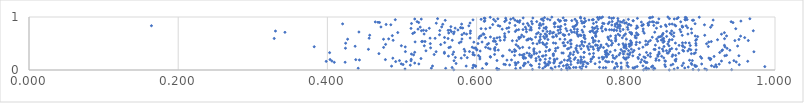
| Category | Series 0 |
|---|---|
| 0.8582741364750182 | 0.001 |
| 0.8976763181570795 | 0.002 |
| 0.8237760456987292 | 0.003 |
| 0.5694237773553649 | 0.004 |
| 0.9084141558878296 | 0.005 |
| 0.9418973582718112 | 0.006 |
| 0.7216196528349432 | 0.007 |
| 0.7136465965242803 | 0.008 |
| 0.6276302751861649 | 0.009 |
| 0.8901277438105396 | 0.01 |
| 0.6749223983946601 | 0.011 |
| 0.8370869075136855 | 0.012 |
| 0.6298730154496538 | 0.013 |
| 0.8273972351592285 | 0.014 |
| 0.8280837848045491 | 0.015 |
| 0.7014530784217442 | 0.016 |
| 0.8648321436666556 | 0.017 |
| 0.7938838933704971 | 0.018 |
| 0.5040525475562254 | 0.019 |
| 0.7406610888725684 | 0.02 |
| 0.9059473629559929 | 0.021 |
| 0.8307056241590003 | 0.022 |
| 0.7847032862850102 | 0.023 |
| 0.8387430591247179 | 0.024 |
| 0.8108602469489412 | 0.025 |
| 0.8265340313378468 | 0.026 |
| 0.6077258045349223 | 0.027 |
| 0.6523791735753867 | 0.028 |
| 0.725063278326307 | 0.029 |
| 0.6889151818714941 | 0.03 |
| 0.5585385371477021 | 0.031 |
| 0.6270687100896097 | 0.032 |
| 0.44128946082872156 | 0.033 |
| 0.5393229535069063 | 0.034 |
| 0.8381219890604471 | 0.035 |
| 0.720513458083019 | 0.036 |
| 0.6997725069637214 | 0.037 |
| 0.8790277277675254 | 0.038 |
| 0.6586434599082034 | 0.039 |
| 0.8694817511855355 | 0.04 |
| 0.5947266824163308 | 0.041 |
| 0.8096242450041077 | 0.042 |
| 0.7699148923073809 | 0.043 |
| 0.827348611495336 | 0.044 |
| 0.7731475927238503 | 0.045 |
| 0.7852797130322222 | 0.046 |
| 0.5671614494786639 | 0.047 |
| 0.7332083774916002 | 0.048 |
| 0.7300082533122625 | 0.049 |
| 0.764747616912369 | 0.05 |
| 0.683904922039382 | 0.051 |
| 0.7239705534848434 | 0.052 |
| 0.8126485312027693 | 0.053 |
| 0.7384041704326343 | 0.054 |
| 0.7939337775069143 | 0.055 |
| 0.8837233391431959 | 0.056 |
| 0.7053134171339153 | 0.057 |
| 0.8345215730469541 | 0.058 |
| 0.8033565028722792 | 0.059 |
| 0.9216912793096238 | 0.06 |
| 0.7467499574226467 | 0.061 |
| 0.9184354692431691 | 0.062 |
| 0.6916877344854793 | 0.063 |
| 0.9863452563813437 | 0.064 |
| 0.8531298462391763 | 0.065 |
| 0.8152474968169845 | 0.066 |
| 0.8932193576928893 | 0.067 |
| 0.788804783527499 | 0.068 |
| 0.5986289522120753 | 0.069 |
| 0.71051275683214 | 0.07 |
| 0.7420151595686844 | 0.071 |
| 0.8947660037787537 | 0.072 |
| 0.4859913315547175 | 0.073 |
| 0.586017793612868 | 0.074 |
| 0.5408930124378334 | 0.075 |
| 0.8360283785300437 | 0.076 |
| 0.5985974232400109 | 0.077 |
| 0.8230012174411447 | 0.078 |
| 0.71635250161292 | 0.079 |
| 0.9148802630985745 | 0.08 |
| 0.6628800588081458 | 0.081 |
| 0.6735982482057143 | 0.082 |
| 0.8754704759497594 | 0.083 |
| 0.8018645242041955 | 0.084 |
| 0.7202793350578675 | 0.085 |
| 0.6937111075323674 | 0.086 |
| 0.5964522075114794 | 0.087 |
| 0.8924737415649081 | 0.088 |
| 0.6630993116032446 | 0.089 |
| 0.595596661095406 | 0.09 |
| 0.5111539935415604 | 0.091 |
| 0.8605487900653713 | 0.092 |
| 0.7219119212028842 | 0.093 |
| 0.6523314785066997 | 0.094 |
| 0.644273276599542 | 0.095 |
| 0.6961365769236965 | 0.096 |
| 0.6721205086814975 | 0.097 |
| 0.8522915227807563 | 0.098 |
| 0.9207568586809256 | 0.099 |
| 0.9521034114384889 | 0.1 |
| 0.721203620401484 | 0.101 |
| 0.6386050780346194 | 0.102 |
| 0.5014860420094708 | 0.103 |
| 0.7263607834323498 | 0.104 |
| 0.8885564878332559 | 0.105 |
| 0.6131774869483361 | 0.106 |
| 0.7427921003637168 | 0.107 |
| 0.8630989765681591 | 0.108 |
| 0.6365451297854502 | 0.109 |
| 0.9251820246565144 | 0.11 |
| 0.6840466550782527 | 0.111 |
| 0.6952049464310714 | 0.112 |
| 0.9016961942884266 | 0.113 |
| 0.5225894145029972 | 0.114 |
| 0.7877193996984917 | 0.115 |
| 0.49901359586347394 | 0.116 |
| 0.6531980461106117 | 0.117 |
| 0.6137103922300591 | 0.118 |
| 0.7588471094654766 | 0.119 |
| 0.6127587380566814 | 0.12 |
| 0.7492065142721007 | 0.121 |
| 0.6653063161556252 | 0.122 |
| 0.5724797340733343 | 0.123 |
| 0.6919443023335441 | 0.124 |
| 0.887775190024627 | 0.125 |
| 0.7872191051224524 | 0.126 |
| 0.6640776386633368 | 0.127 |
| 0.8772568626562063 | 0.128 |
| 0.7117718318640962 | 0.129 |
| 0.7479834530722981 | 0.13 |
| 0.5170516962216556 | 0.131 |
| 0.7035643541820445 | 0.132 |
| 0.7936544616227341 | 0.133 |
| 0.7394412461274775 | 0.134 |
| 0.8020146003192212 | 0.135 |
| 0.7356486588664339 | 0.136 |
| 0.6982336398733634 | 0.137 |
| 0.6516982887796747 | 0.138 |
| 0.9390756271664052 | 0.139 |
| 0.703751328423472 | 0.14 |
| 0.828431750318176 | 0.141 |
| 0.6913240975167729 | 0.142 |
| 0.8267787471165376 | 0.143 |
| 0.6557147427029507 | 0.144 |
| 0.40922007996131926 | 0.145 |
| 0.42376840282240735 | 0.146 |
| 0.8199097765345135 | 0.147 |
| 0.6690711219435642 | 0.148 |
| 0.7138193278340502 | 0.149 |
| 0.7649235464511379 | 0.15 |
| 0.9480930056666708 | 0.151 |
| 0.7751211741671672 | 0.152 |
| 0.7423362245660975 | 0.153 |
| 0.7820380174478635 | 0.154 |
| 0.7772850506151127 | 0.155 |
| 0.7450496844802189 | 0.156 |
| 0.6970199255001501 | 0.157 |
| 0.5057764141821302 | 0.158 |
| 0.4915293472723925 | 0.159 |
| 0.7530412249525755 | 0.16 |
| 0.7261960749198186 | 0.161 |
| 0.7394898579108997 | 0.162 |
| 0.39840193632108767 | 0.163 |
| 0.9634443332764876 | 0.164 |
| 0.824909611711165 | 0.165 |
| 0.8531487201098605 | 0.166 |
| 0.7729292811319619 | 0.167 |
| 0.8669036944757307 | 0.168 |
| 0.9282313750918887 | 0.169 |
| 0.4059776258248631 | 0.17 |
| 0.7047686554659525 | 0.171 |
| 0.8523778988484354 | 0.172 |
| 0.6796905246392269 | 0.173 |
| 0.512122007612196 | 0.174 |
| 0.5697570883010715 | 0.175 |
| 0.9449302694775105 | 0.176 |
| 0.4966236866631476 | 0.177 |
| 0.8891972235415212 | 0.178 |
| 0.6273161460076018 | 0.179 |
| 0.7218135173474557 | 0.18 |
| 0.7360994141310385 | 0.181 |
| 0.8403213431574477 | 0.182 |
| 0.8445251296891821 | 0.183 |
| 0.8854598691364275 | 0.184 |
| 0.6851690340423318 | 0.185 |
| 0.6406830458229078 | 0.186 |
| 0.8660185780543344 | 0.187 |
| 0.7176709679625801 | 0.188 |
| 0.4429156773063323 | 0.189 |
| 0.6467454686423485 | 0.19 |
| 0.7041964988755149 | 0.191 |
| 0.7235820084747144 | 0.192 |
| 0.8213264437394915 | 0.193 |
| 0.9132457681950416 | 0.194 |
| 0.4380238822908109 | 0.195 |
| 0.47775142312853847 | 0.196 |
| 0.4035524476639756 | 0.197 |
| 0.7403329388743919 | 0.198 |
| 0.6852401432731102 | 0.199 |
| 0.7308629213624765 | 0.2 |
| 0.7042224337131212 | 0.201 |
| 0.5123529038467153 | 0.202 |
| 0.8001908170853671 | 0.203 |
| 0.6920817474447165 | 0.204 |
| 0.7532727865347737 | 0.205 |
| 0.8674686824438528 | 0.206 |
| 0.7691384583560632 | 0.207 |
| 0.7542908467044508 | 0.208 |
| 0.604450082546534 | 0.209 |
| 0.9140183111713269 | 0.21 |
| 0.7078417061318952 | 0.211 |
| 0.7986071386932799 | 0.212 |
| 0.9135562676843748 | 0.213 |
| 0.8406895910548227 | 0.214 |
| 0.8168510536099371 | 0.215 |
| 0.5254304153991952 | 0.216 |
| 0.6796228207506474 | 0.217 |
| 0.6631027516596061 | 0.218 |
| 0.6981981143518146 | 0.219 |
| 0.7853752898928222 | 0.22 |
| 0.7252729752644071 | 0.221 |
| 0.9016754412950982 | 0.222 |
| 0.48772087337826475 | 0.223 |
| 0.579366026509506 | 0.224 |
| 0.9114261133873491 | 0.225 |
| 0.6656789324042717 | 0.226 |
| 0.801004524993636 | 0.227 |
| 0.7640624321156169 | 0.228 |
| 0.8508654586026889 | 0.229 |
| 0.7833924937152841 | 0.23 |
| 0.7323172187649395 | 0.231 |
| 0.826078555575667 | 0.232 |
| 0.5874454064504654 | 0.233 |
| 0.6624720127500072 | 0.234 |
| 0.7970571549735359 | 0.235 |
| 0.7707498724123028 | 0.236 |
| 0.5715391714333865 | 0.237 |
| 0.8163650070177663 | 0.238 |
| 0.6729637792200457 | 0.239 |
| 0.7436410776056688 | 0.24 |
| 0.8035398044861682 | 0.241 |
| 0.6185827481004782 | 0.242 |
| 0.7683001344850062 | 0.243 |
| 0.7566498639248251 | 0.244 |
| 0.6043980583315326 | 0.245 |
| 0.7396865584927725 | 0.246 |
| 0.82422102823127 | 0.247 |
| 0.7742831743883563 | 0.248 |
| 0.6832705747456064 | 0.249 |
| 0.7563428830135567 | 0.25 |
| 0.9001272639893485 | 0.251 |
| 0.8329982261493788 | 0.252 |
| 0.6183809799610159 | 0.253 |
| 0.6631192319487419 | 0.254 |
| 0.7876371224831229 | 0.255 |
| 0.9183737380282514 | 0.256 |
| 0.8621462819942931 | 0.257 |
| 0.8430450605545056 | 0.258 |
| 0.8480424471388103 | 0.259 |
| 0.7235367505965271 | 0.26 |
| 0.6881931110354094 | 0.261 |
| 0.5622826218805154 | 0.262 |
| 0.6346940974018793 | 0.263 |
| 0.7742684167817606 | 0.264 |
| 0.6894490330542583 | 0.265 |
| 0.6354452560073114 | 0.266 |
| 0.8093984967486207 | 0.267 |
| 0.932731659107641 | 0.268 |
| 0.9515928602647085 | 0.269 |
| 0.702939961251546 | 0.27 |
| 0.6706993181959305 | 0.271 |
| 0.6738968448378818 | 0.272 |
| 0.6025608675158171 | 0.273 |
| 0.7824251576304497 | 0.274 |
| 0.8668080216378115 | 0.275 |
| 0.6509378804977536 | 0.276 |
| 0.9350138021501914 | 0.277 |
| 0.6928588596485337 | 0.278 |
| 0.8297408614179765 | 0.279 |
| 0.5837478279601344 | 0.28 |
| 0.6612459655849251 | 0.281 |
| 0.5969962184032506 | 0.282 |
| 0.842777753706921 | 0.283 |
| 0.7909747641554549 | 0.284 |
| 0.5154907707932904 | 0.285 |
| 0.8630366493188799 | 0.286 |
| 0.8048224351376025 | 0.287 |
| 0.6578562388096575 | 0.288 |
| 0.8185351671108031 | 0.289 |
| 0.7295296635616885 | 0.29 |
| 0.5951372496175819 | 0.291 |
| 0.543119701789794 | 0.292 |
| 0.7729665870479432 | 0.293 |
| 0.6240853148777609 | 0.294 |
| 0.5679843055495114 | 0.295 |
| 0.776791030349619 | 0.296 |
| 0.7254992635210809 | 0.297 |
| 0.6636987167000702 | 0.298 |
| 0.702660434587025 | 0.299 |
| 0.8025569746284585 | 0.3 |
| 0.5126272276099963 | 0.301 |
| 0.7968985642745368 | 0.302 |
| 0.7029876105349265 | 0.303 |
| 0.7513859944607001 | 0.304 |
| 0.6772508164527109 | 0.305 |
| 0.6708607380079356 | 0.306 |
| 0.8448380213794393 | 0.307 |
| 0.8879009130740776 | 0.308 |
| 0.46908875763310065 | 0.309 |
| 0.891637247099603 | 0.31 |
| 0.775173601410945 | 0.311 |
| 0.8329263656347687 | 0.312 |
| 0.7567570909341929 | 0.313 |
| 0.5568750593757897 | 0.314 |
| 0.6802981467118386 | 0.315 |
| 0.8711453958351566 | 0.316 |
| 0.7923940792892693 | 0.317 |
| 0.8555596661109581 | 0.318 |
| 0.7161299676537856 | 0.319 |
| 0.7256702663998057 | 0.32 |
| 0.8570035809742791 | 0.321 |
| 0.7143132210107085 | 0.322 |
| 0.667526914355272 | 0.323 |
| 0.8059361013705348 | 0.324 |
| 0.8932508615928573 | 0.325 |
| 0.7730375054155892 | 0.326 |
| 0.40298241484974284 | 0.327 |
| 0.5952344966262383 | 0.328 |
| 0.7357423782290057 | 0.329 |
| 0.9258685370116716 | 0.33 |
| 0.8276870149861021 | 0.331 |
| 0.7441166624661839 | 0.332 |
| 0.7442201449435935 | 0.333 |
| 0.517034888166451 | 0.334 |
| 0.5568336723396891 | 0.335 |
| 0.7728564760716419 | 0.336 |
| 0.844522142997021 | 0.337 |
| 0.8092784136434801 | 0.338 |
| 0.5692143403636463 | 0.339 |
| 0.7304336072277758 | 0.34 |
| 0.6846163980814678 | 0.341 |
| 0.7791073778291748 | 0.342 |
| 0.6474553201184561 | 0.343 |
| 0.9717170937460184 | 0.344 |
| 0.545739941487806 | 0.345 |
| 0.6770168771301494 | 0.346 |
| 0.5045537319009502 | 0.347 |
| 0.5904344167136568 | 0.348 |
| 0.7959929480401952 | 0.349 |
| 0.6510115901634027 | 0.35 |
| 0.798334988101841 | 0.351 |
| 0.5844628187263631 | 0.352 |
| 0.6926166651098482 | 0.353 |
| 0.772339913609341 | 0.354 |
| 0.8586561837798175 | 0.355 |
| 0.8775939230017422 | 0.356 |
| 0.8501869598478652 | 0.357 |
| 0.6047666130947095 | 0.358 |
| 0.7056569792695385 | 0.359 |
| 0.8831728264718752 | 0.36 |
| 0.6525100544843159 | 0.361 |
| 0.5321010484827982 | 0.362 |
| 0.9285985967154812 | 0.363 |
| 0.7342281687415043 | 0.364 |
| 0.8544067329936805 | 0.365 |
| 0.8037455826115288 | 0.366 |
| 0.6970965509432656 | 0.367 |
| 0.8110495433105981 | 0.368 |
| 0.7745485859960419 | 0.369 |
| 0.6246697192289685 | 0.37 |
| 0.7857040281448109 | 0.371 |
| 0.7630462693240719 | 0.372 |
| 0.9394844535200422 | 0.373 |
| 0.8762930782246863 | 0.374 |
| 0.6441839863423131 | 0.375 |
| 0.6291147950627101 | 0.376 |
| 0.6002766028683125 | 0.377 |
| 0.9296126120052417 | 0.378 |
| 0.6765457940309099 | 0.379 |
| 0.8942371038295472 | 0.38 |
| 0.88723537002464 | 0.381 |
| 0.6980065690783607 | 0.382 |
| 0.7503943375371546 | 0.383 |
| 0.6508305989667271 | 0.384 |
| 0.7936321792144367 | 0.385 |
| 0.6002740684743854 | 0.386 |
| 0.8393363254883608 | 0.387 |
| 0.8592575848409291 | 0.388 |
| 0.8378746504117336 | 0.389 |
| 0.45500125071823194 | 0.39 |
| 0.5832998883156405 | 0.391 |
| 0.7566730070347412 | 0.392 |
| 0.8074602530492965 | 0.393 |
| 0.8677999306287894 | 0.394 |
| 0.8849802033181154 | 0.395 |
| 0.8491327256108735 | 0.396 |
| 0.6182087219211516 | 0.397 |
| 0.6238954379885004 | 0.398 |
| 0.7218833134342563 | 0.399 |
| 0.7400972556808333 | 0.4 |
| 0.7333037256341717 | 0.401 |
| 0.6769895037573368 | 0.402 |
| 0.8176422458456374 | 0.403 |
| 0.861596312058957 | 0.404 |
| 0.8008400677263291 | 0.405 |
| 0.7059525087684428 | 0.406 |
| 0.7236984663204293 | 0.407 |
| 0.9357746712527453 | 0.408 |
| 0.7625191202584245 | 0.409 |
| 0.7644136356520626 | 0.41 |
| 0.4242016712236679 | 0.411 |
| 0.6577385425967344 | 0.412 |
| 0.61572674800429 | 0.413 |
| 0.5966829516385175 | 0.414 |
| 0.7331050401358641 | 0.415 |
| 0.8448250602580282 | 0.416 |
| 0.5987696995652665 | 0.417 |
| 0.5383384754529609 | 0.418 |
| 0.7494000823352697 | 0.419 |
| 0.6705946321022107 | 0.42 |
| 0.7089013191010604 | 0.421 |
| 0.562835295938884 | 0.422 |
| 0.7700579842645395 | 0.423 |
| 0.6247574901267535 | 0.424 |
| 0.7976112215487932 | 0.425 |
| 0.4753452823644143 | 0.426 |
| 0.8788026233608505 | 0.427 |
| 0.6617441339210991 | 0.428 |
| 0.6120936775524779 | 0.429 |
| 0.5941618269946882 | 0.43 |
| 0.8229139226664309 | 0.431 |
| 0.7264453353151331 | 0.432 |
| 0.5648698380498439 | 0.433 |
| 0.6937050380750971 | 0.434 |
| 0.7559056889166946 | 0.435 |
| 0.5043651284619696 | 0.436 |
| 0.9329246505092607 | 0.437 |
| 0.7983522133907017 | 0.438 |
| 0.38232471976379134 | 0.439 |
| 0.7663672763700361 | 0.44 |
| 0.7980137134054377 | 0.441 |
| 0.7530917798148653 | 0.442 |
| 0.9106628874472238 | 0.443 |
| 0.8512266266685881 | 0.444 |
| 0.8049887451052631 | 0.445 |
| 0.6555357099995862 | 0.446 |
| 0.8761977204811647 | 0.447 |
| 0.4371694695083219 | 0.448 |
| 0.748593955802339 | 0.449 |
| 0.8000665409151727 | 0.45 |
| 0.7382754025729796 | 0.451 |
| 0.9498654987285099 | 0.452 |
| 0.743464558768164 | 0.453 |
| 0.7767059660049119 | 0.454 |
| 0.7172338178311412 | 0.455 |
| 0.8579759645835248 | 0.456 |
| 0.529889447030162 | 0.457 |
| 0.4991499900521096 | 0.458 |
| 0.7344412633160132 | 0.459 |
| 0.7186196769033993 | 0.46 |
| 0.8864738187502498 | 0.461 |
| 0.7621186525335506 | 0.462 |
| 0.7974415469543457 | 0.463 |
| 0.8760618029639792 | 0.464 |
| 0.871420442187014 | 0.465 |
| 0.9322462649003304 | 0.466 |
| 0.8942001736285748 | 0.467 |
| 0.7595349022490397 | 0.468 |
| 0.8396609597560512 | 0.469 |
| 0.7807666389589077 | 0.47 |
| 0.766781600174193 | 0.471 |
| 0.7600361663936063 | 0.472 |
| 0.6916387044153001 | 0.473 |
| 0.8074359485778111 | 0.474 |
| 0.8267094599450336 | 0.475 |
| 0.8050231261828162 | 0.476 |
| 0.6529043327484367 | 0.477 |
| 0.8000628292318607 | 0.478 |
| 0.8137138481796385 | 0.479 |
| 0.5518695309386712 | 0.48 |
| 0.7905197800610814 | 0.481 |
| 0.6143024839238072 | 0.482 |
| 0.47801732396350904 | 0.483 |
| 0.7410414394762322 | 0.484 |
| 0.8290704997029128 | 0.485 |
| 0.6268365482596113 | 0.486 |
| 0.8064300906576498 | 0.487 |
| 0.7265611375612478 | 0.488 |
| 0.7742250705267647 | 0.489 |
| 0.8045109530371417 | 0.49 |
| 0.8562962481991788 | 0.491 |
| 0.6893812566498186 | 0.492 |
| 0.7510477479091948 | 0.493 |
| 0.6810774084295128 | 0.494 |
| 0.9082801462652943 | 0.495 |
| 0.7963463521011159 | 0.496 |
| 0.726383071374737 | 0.497 |
| 0.5379725368596763 | 0.498 |
| 0.6018803604463271 | 0.499 |
| 0.6941052228427806 | 0.5 |
| 0.6160781284604702 | 0.501 |
| 0.8938739661805741 | 0.502 |
| 0.6754772313325117 | 0.503 |
| 0.7059694393103445 | 0.504 |
| 0.42446221698256537 | 0.505 |
| 0.7820808879406383 | 0.506 |
| 0.8075231697372253 | 0.507 |
| 0.8665100367271518 | 0.508 |
| 0.8850699925900317 | 0.509 |
| 0.7157436993210632 | 0.51 |
| 0.7029435095900985 | 0.511 |
| 0.5767506297927731 | 0.512 |
| 0.8759884748274545 | 0.513 |
| 0.8801478487809612 | 0.514 |
| 0.6884683832484525 | 0.515 |
| 0.7166519532794318 | 0.516 |
| 0.5571916951846254 | 0.517 |
| 0.6845323880143538 | 0.518 |
| 0.8187307393764381 | 0.519 |
| 0.7222400353931301 | 0.52 |
| 0.8500466278380759 | 0.521 |
| 0.8075123853912978 | 0.522 |
| 0.7563367461943392 | 0.523 |
| 0.8142878174213815 | 0.524 |
| 0.5963241993853069 | 0.525 |
| 0.7451977134020247 | 0.526 |
| 0.9111115322656899 | 0.527 |
| 0.6073454707278161 | 0.528 |
| 0.741244660578632 | 0.529 |
| 0.5175613763592313 | 0.53 |
| 0.5791891285324516 | 0.531 |
| 0.8303041075163181 | 0.532 |
| 0.7413960528607909 | 0.533 |
| 0.8574254178074988 | 0.534 |
| 0.7409868877794564 | 0.535 |
| 0.9145899977662599 | 0.536 |
| 0.5263820038914411 | 0.537 |
| 0.5308547280560618 | 0.538 |
| 0.5276178454162466 | 0.539 |
| 0.6250432013354896 | 0.54 |
| 0.8513900723031151 | 0.541 |
| 0.62485362554709 | 0.542 |
| 0.76377284684608 | 0.543 |
| 0.8427355231195475 | 0.544 |
| 0.622418406368415 | 0.545 |
| 0.826746229406359 | 0.546 |
| 0.7863029424908184 | 0.547 |
| 0.6838608335798225 | 0.548 |
| 0.7590010792159912 | 0.549 |
| 0.7805554633121371 | 0.55 |
| 0.8063951624049296 | 0.551 |
| 0.6479216937791347 | 0.552 |
| 0.6539175463456067 | 0.553 |
| 0.7253422640026091 | 0.554 |
| 0.9462237835576346 | 0.555 |
| 0.9642054517671322 | 0.556 |
| 0.8329421692938219 | 0.557 |
| 0.8936730199483588 | 0.558 |
| 0.6316771051969887 | 0.559 |
| 0.4881444660149453 | 0.56 |
| 0.5673938865560895 | 0.561 |
| 0.7567337359248083 | 0.562 |
| 0.8476499496255399 | 0.563 |
| 0.7265733047480757 | 0.564 |
| 0.6672778908198275 | 0.565 |
| 0.6372005112961857 | 0.566 |
| 0.8502680457773614 | 0.567 |
| 0.6687763161812786 | 0.568 |
| 0.7866567119328961 | 0.569 |
| 0.8585923899547795 | 0.57 |
| 0.9229901486782406 | 0.571 |
| 0.7774379092185049 | 0.572 |
| 0.8621138096437265 | 0.573 |
| 0.6956759892738528 | 0.574 |
| 0.673879839545223 | 0.575 |
| 0.9516251365077187 | 0.576 |
| 0.894776532107261 | 0.577 |
| 0.6853873578073194 | 0.578 |
| 0.7183587873445463 | 0.579 |
| 0.4752318897234791 | 0.58 |
| 0.4270985341916068 | 0.581 |
| 0.8008043757538059 | 0.582 |
| 0.711744281625055 | 0.583 |
| 0.8413542796535792 | 0.584 |
| 0.5803655426178302 | 0.585 |
| 0.6694646082398527 | 0.586 |
| 0.48211640913610243 | 0.587 |
| 0.7454933292990865 | 0.588 |
| 0.8497086905109069 | 0.589 |
| 0.6569940381367665 | 0.59 |
| 0.9323625922828842 | 0.591 |
| 0.6720533734506038 | 0.592 |
| 0.6233996588356254 | 0.593 |
| 0.561751952520479 | 0.594 |
| 0.3286996473552184 | 0.595 |
| 0.6914190615239783 | 0.596 |
| 0.8507094738024783 | 0.597 |
| 0.5443845742108763 | 0.598 |
| 0.6030694475613868 | 0.599 |
| 0.4559718888750124 | 0.6 |
| 0.5376271557089476 | 0.601 |
| 0.7555608768037843 | 0.602 |
| 0.7862606306015825 | 0.603 |
| 0.5913428907020831 | 0.604 |
| 0.8140319453506046 | 0.605 |
| 0.7764620054368285 | 0.606 |
| 0.6274316160606219 | 0.607 |
| 0.795404830291479 | 0.608 |
| 0.7552828652149599 | 0.609 |
| 0.6119231410632842 | 0.61 |
| 0.9593691372549882 | 0.611 |
| 0.8127735865782016 | 0.612 |
| 0.7439969450129428 | 0.613 |
| 0.5569970147751275 | 0.614 |
| 0.6381674189601408 | 0.615 |
| 0.6307776031225064 | 0.616 |
| 0.6590734966229648 | 0.617 |
| 0.6566045122227679 | 0.618 |
| 0.835528050506326 | 0.619 |
| 0.6790647090276617 | 0.62 |
| 0.8438488715875638 | 0.621 |
| 0.7760075142994476 | 0.622 |
| 0.7030380646863447 | 0.623 |
| 0.6185587808408272 | 0.624 |
| 0.7019920012090016 | 0.625 |
| 0.6851810476479684 | 0.626 |
| 0.8458299852274825 | 0.627 |
| 0.6938276680366227 | 0.628 |
| 0.6632327720526807 | 0.629 |
| 0.8963544994509307 | 0.63 |
| 0.6898551114822987 | 0.631 |
| 0.6041156075038745 | 0.632 |
| 0.7598278012703956 | 0.633 |
| 0.8547351252662692 | 0.634 |
| 0.8642879075049689 | 0.635 |
| 0.7362550431037121 | 0.636 |
| 0.7072464920634594 | 0.637 |
| 0.8477484252714027 | 0.638 |
| 0.9538679485079236 | 0.639 |
| 0.6376085375430395 | 0.64 |
| 0.7795812444249443 | 0.641 |
| 0.8930998764560661 | 0.642 |
| 0.9350623688580111 | 0.643 |
| 0.7446213616653613 | 0.644 |
| 0.8125773746009007 | 0.645 |
| 0.7864839490670256 | 0.646 |
| 0.7595945798884232 | 0.647 |
| 0.4870123281144898 | 0.648 |
| 0.606128615319656 | 0.649 |
| 0.7399637135998894 | 0.65 |
| 0.7974596843148971 | 0.651 |
| 0.7173524714699485 | 0.652 |
| 0.7917607647522844 | 0.653 |
| 0.8756582481202541 | 0.654 |
| 0.9058081521194465 | 0.655 |
| 0.45670733736486635 | 0.656 |
| 0.7181881091053017 | 0.657 |
| 0.6937254304474617 | 0.658 |
| 0.6605159962401382 | 0.659 |
| 0.7439593139180267 | 0.66 |
| 0.8155473445823261 | 0.661 |
| 0.7386219648142367 | 0.662 |
| 0.7065132888677822 | 0.663 |
| 0.735415091130252 | 0.664 |
| 0.5502879990518519 | 0.665 |
| 0.5803682439667224 | 0.666 |
| 0.8492723315709201 | 0.667 |
| 0.8165702519642725 | 0.668 |
| 0.7159513567728194 | 0.669 |
| 0.8614137628847853 | 0.67 |
| 0.723790669110183 | 0.671 |
| 0.6858471398048258 | 0.672 |
| 0.6098368316331753 | 0.673 |
| 0.8077316825962116 | 0.674 |
| 0.7896922363195971 | 0.675 |
| 0.9282406568433176 | 0.676 |
| 0.5865126654834706 | 0.677 |
| 0.883297491445163 | 0.678 |
| 0.5296457924713707 | 0.679 |
| 0.7995234304761623 | 0.68 |
| 0.6918867660181675 | 0.681 |
| 0.6803645421555862 | 0.682 |
| 0.7594919848387336 | 0.683 |
| 0.6088143132215117 | 0.684 |
| 0.5691885609247606 | 0.685 |
| 0.6375934361716377 | 0.686 |
| 0.6979282851357452 | 0.687 |
| 0.514415234985186 | 0.688 |
| 0.8073737478901039 | 0.689 |
| 0.8499588583430129 | 0.69 |
| 0.7342676314240235 | 0.691 |
| 0.7101187111579347 | 0.692 |
| 0.5915091335197928 | 0.693 |
| 0.583253821909916 | 0.694 |
| 0.8246762920364714 | 0.695 |
| 0.8596505225422602 | 0.696 |
| 0.7016838329651923 | 0.697 |
| 0.5625860716365153 | 0.698 |
| 0.8883364507079001 | 0.699 |
| 0.8143254912972752 | 0.7 |
| 0.8644382810623744 | 0.701 |
| 0.8075520814507543 | 0.702 |
| 0.757575836349958 | 0.703 |
| 0.9321495642131934 | 0.704 |
| 0.6827052840791924 | 0.705 |
| 0.4943254100929815 | 0.706 |
| 0.7124401572418865 | 0.707 |
| 0.516720423211007 | 0.708 |
| 0.7032822381342495 | 0.709 |
| 0.8053482037242082 | 0.71 |
| 0.3430872433632387 | 0.711 |
| 0.7276634314941722 | 0.712 |
| 0.8387936902086565 | 0.713 |
| 0.7310178308450218 | 0.714 |
| 0.7425361176740348 | 0.715 |
| 0.7598885416599729 | 0.716 |
| 0.44226730250400403 | 0.717 |
| 0.5700142167319654 | 0.718 |
| 0.6431071903513419 | 0.719 |
| 0.6668523346304519 | 0.72 |
| 0.8738707912877164 | 0.721 |
| 0.7522378337224793 | 0.722 |
| 0.566347739903198 | 0.723 |
| 0.7521936861461986 | 0.724 |
| 0.7349421251403501 | 0.725 |
| 0.6946091438927171 | 0.726 |
| 0.6519118735276833 | 0.727 |
| 0.6986311027772795 | 0.728 |
| 0.8547866799937532 | 0.729 |
| 0.7615506098885589 | 0.73 |
| 0.8232597913203165 | 0.731 |
| 0.7926343610842972 | 0.732 |
| 0.7554320806647923 | 0.733 |
| 0.7686339471064968 | 0.734 |
| 0.3303811731624261 | 0.735 |
| 0.5917517035573501 | 0.736 |
| 0.861442632647639 | 0.737 |
| 0.6889232073582362 | 0.738 |
| 0.7211479505181749 | 0.739 |
| 0.9709273693456294 | 0.74 |
| 0.5260455703688669 | 0.741 |
| 0.5324431562227262 | 0.742 |
| 0.7550225955541955 | 0.743 |
| 0.5506835747400467 | 0.744 |
| 0.7840065947404982 | 0.745 |
| 0.7877860032416334 | 0.746 |
| 0.7092113383323579 | 0.747 |
| 0.5618801421542158 | 0.748 |
| 0.7261533112071864 | 0.749 |
| 0.5287373266920393 | 0.75 |
| 0.7414021612082226 | 0.751 |
| 0.5647868265856912 | 0.752 |
| 0.6536164299909055 | 0.753 |
| 0.6732200507382052 | 0.754 |
| 0.5749888713816997 | 0.755 |
| 0.7733478438384638 | 0.756 |
| 0.6713212367038499 | 0.757 |
| 0.7811441617292963 | 0.758 |
| 0.7782106847771009 | 0.759 |
| 0.7845910749815863 | 0.76 |
| 0.6563960434004169 | 0.761 |
| 0.6621917658135307 | 0.762 |
| 0.8725822061092587 | 0.763 |
| 0.7964078863373519 | 0.764 |
| 0.7123369528365249 | 0.765 |
| 0.8028800159192138 | 0.766 |
| 0.7351228969088439 | 0.767 |
| 0.666415462046091 | 0.768 |
| 0.7728555093480317 | 0.769 |
| 0.6343244685576843 | 0.77 |
| 0.5214368751206163 | 0.771 |
| 0.6729667185281724 | 0.772 |
| 0.7310015762226066 | 0.773 |
| 0.8879192467878876 | 0.774 |
| 0.8233153744884094 | 0.775 |
| 0.6928433616839059 | 0.776 |
| 0.6121870366739001 | 0.777 |
| 0.7622893977240097 | 0.778 |
| 0.94740084638539 | 0.779 |
| 0.6060049445712499 | 0.78 |
| 0.7196289079512244 | 0.781 |
| 0.7575223945833918 | 0.782 |
| 0.7918123456618013 | 0.783 |
| 0.8139678331146143 | 0.784 |
| 0.5120768876708247 | 0.785 |
| 0.6405208044319689 | 0.786 |
| 0.5365811138193499 | 0.787 |
| 0.7671734650188891 | 0.788 |
| 0.8411471137499221 | 0.789 |
| 0.5712446415163828 | 0.79 |
| 0.6840785010005992 | 0.791 |
| 0.5814321538308173 | 0.792 |
| 0.6903685726877877 | 0.793 |
| 0.7587907978645388 | 0.794 |
| 0.5790998259090724 | 0.795 |
| 0.6180227338788501 | 0.796 |
| 0.6931601620562424 | 0.797 |
| 0.8828243163011277 | 0.798 |
| 0.6431668974971814 | 0.799 |
| 0.5784720572758192 | 0.8 |
| 0.7886614557229293 | 0.801 |
| 0.7552071455950775 | 0.802 |
| 0.815879703240569 | 0.803 |
| 0.6727713181453923 | 0.804 |
| 0.80227151830788 | 0.805 |
| 0.9136810669342151 | 0.806 |
| 0.6653590996008962 | 0.807 |
| 0.6932232754934152 | 0.808 |
| 0.5243991461963272 | 0.809 |
| 0.7113863085496025 | 0.81 |
| 0.8757904774092147 | 0.811 |
| 0.4717747080398468 | 0.812 |
| 0.5531934508724785 | 0.813 |
| 0.8764042732549164 | 0.814 |
| 0.7046260948483895 | 0.815 |
| 0.709147361646388 | 0.816 |
| 0.7292088267486571 | 0.817 |
| 0.5655742366026293 | 0.818 |
| 0.7444177943116103 | 0.819 |
| 0.8470547402206107 | 0.82 |
| 0.768242466927435 | 0.821 |
| 0.7312368183373588 | 0.822 |
| 0.7611778556029517 | 0.823 |
| 0.8543009763529038 | 0.824 |
| 0.7129775325234574 | 0.825 |
| 0.7856965308581226 | 0.826 |
| 0.6311749825733677 | 0.827 |
| 0.7902021619401499 | 0.828 |
| 0.8754758866159289 | 0.829 |
| 0.7927093925597928 | 0.83 |
| 0.8148766391627937 | 0.831 |
| 0.8670067616478397 | 0.832 |
| 0.589597469446664 | 0.833 |
| 0.8808696434253517 | 0.834 |
| 0.16413188258780909 | 0.835 |
| 0.7325680007310964 | 0.836 |
| 0.821440680165851 | 0.837 |
| 0.6288630203241746 | 0.838 |
| 0.6699309954374126 | 0.839 |
| 0.6516690807061717 | 0.84 |
| 0.8375516782194067 | 0.841 |
| 0.6863314292498359 | 0.842 |
| 0.8069065254050791 | 0.843 |
| 0.9156006617101504 | 0.844 |
| 0.6841679987717278 | 0.845 |
| 0.8300812840076889 | 0.846 |
| 0.8229259024242371 | 0.847 |
| 0.8304169723542669 | 0.848 |
| 0.7812871525155234 | 0.849 |
| 0.8531506117767216 | 0.85 |
| 0.8655291543972188 | 0.851 |
| 0.905463778510105 | 0.852 |
| 0.48502860675763515 | 0.853 |
| 0.7917287239624148 | 0.854 |
| 0.734009495482688 | 0.855 |
| 0.8031785548190696 | 0.856 |
| 0.6215976036398061 | 0.857 |
| 0.823489606708583 | 0.858 |
| 0.4787059908146881 | 0.859 |
| 0.7185978197095926 | 0.86 |
| 0.7885015774947444 | 0.861 |
| 0.5546459799028416 | 0.862 |
| 0.8044909517818555 | 0.863 |
| 0.8585683019792266 | 0.864 |
| 0.7858514233731352 | 0.865 |
| 0.5798972577396264 | 0.866 |
| 0.8621772290587434 | 0.867 |
| 0.6892731806217661 | 0.868 |
| 0.6624584736637132 | 0.869 |
| 0.4203815626161972 | 0.87 |
| 0.703888069301358 | 0.871 |
| 0.6747096875112047 | 0.872 |
| 0.8928640809713803 | 0.873 |
| 0.7764440116229187 | 0.874 |
| 0.7708107490993137 | 0.875 |
| 0.6850082619202643 | 0.876 |
| 0.5127203220089432 | 0.877 |
| 0.7566333309140066 | 0.878 |
| 0.6682518790597717 | 0.879 |
| 0.7052399591553262 | 0.88 |
| 0.8296298664541316 | 0.881 |
| 0.7690129797802243 | 0.882 |
| 0.545964844446757 | 0.883 |
| 0.7414016509688016 | 0.884 |
| 0.7984202307763058 | 0.885 |
| 0.5911965242531606 | 0.886 |
| 0.6443739904833085 | 0.887 |
| 0.7882851740978731 | 0.888 |
| 0.7348913629630189 | 0.889 |
| 0.8006436586407786 | 0.89 |
| 0.8411403529729595 | 0.891 |
| 0.8430796263759579 | 0.892 |
| 0.7047404953750487 | 0.893 |
| 0.9437090535491721 | 0.894 |
| 0.7442821732887493 | 0.895 |
| 0.5223827335457072 | 0.896 |
| 0.46991056275437637 | 0.897 |
| 0.7436606747790832 | 0.898 |
| 0.6571889351213307 | 0.899 |
| 0.46784761302000666 | 0.9 |
| 0.7779336783907695 | 0.901 |
| 0.7950264432532931 | 0.902 |
| 0.7605053645420611 | 0.903 |
| 0.8208764294144844 | 0.904 |
| 0.8318945818560921 | 0.905 |
| 0.8373225641383392 | 0.906 |
| 0.4641704249036671 | 0.907 |
| 0.7928105783466847 | 0.908 |
| 0.8736418736288555 | 0.909 |
| 0.8354435286445029 | 0.91 |
| 0.9412185360925585 | 0.911 |
| 0.5202472428626288 | 0.912 |
| 0.6805973789930009 | 0.913 |
| 0.637678395511532 | 0.914 |
| 0.7817398221821015 | 0.915 |
| 0.6736690143228014 | 0.916 |
| 0.7112996057990951 | 0.917 |
| 0.6102847681693429 | 0.918 |
| 0.6546755266110028 | 0.919 |
| 0.6547551293553351 | 0.92 |
| 0.6252278469416502 | 0.921 |
| 0.7405439381621205 | 0.922 |
| 0.9542969837529159 | 0.923 |
| 0.7460479875808695 | 0.924 |
| 0.7339836672529739 | 0.925 |
| 0.6110897483795616 | 0.926 |
| 0.7898780818404426 | 0.927 |
| 0.8097243222930849 | 0.928 |
| 0.7124578730137854 | 0.929 |
| 0.8100434622674328 | 0.93 |
| 0.6580446901265348 | 0.931 |
| 0.7276126181038305 | 0.932 |
| 0.6895107039011145 | 0.933 |
| 0.797172789757434 | 0.934 |
| 0.7180717493566792 | 0.935 |
| 0.7200021936213026 | 0.936 |
| 0.5579359452680299 | 0.937 |
| 0.8892594473785062 | 0.938 |
| 0.8908806948270949 | 0.939 |
| 0.6515425705492179 | 0.94 |
| 0.6396980522161613 | 0.941 |
| 0.9170934217007514 | 0.942 |
| 0.7506352826383123 | 0.943 |
| 0.8799856318058827 | 0.944 |
| 0.6983457373273043 | 0.945 |
| 0.5951663333949784 | 0.946 |
| 0.7551385063937217 | 0.947 |
| 0.7094726482950919 | 0.948 |
| 0.4910023905662172 | 0.949 |
| 0.7564777696699571 | 0.95 |
| 0.8822384794064013 | 0.951 |
| 0.7633039595333714 | 0.952 |
| 0.8793233639231528 | 0.953 |
| 0.6227973492093875 | 0.954 |
| 0.8034772185503427 | 0.955 |
| 0.606042684097206 | 0.956 |
| 0.6868041479931933 | 0.957 |
| 0.7319271432604948 | 0.958 |
| 0.645700900298503 | 0.959 |
| 0.5258431435176311 | 0.96 |
| 0.6951062035629135 | 0.961 |
| 0.5171013626496994 | 0.962 |
| 0.8649498416848578 | 0.963 |
| 0.6882531687683672 | 0.964 |
| 0.8443022409459594 | 0.965 |
| 0.6284899350343773 | 0.966 |
| 0.9663137657805368 | 0.967 |
| 0.868612113574804 | 0.968 |
| 0.5476701153800514 | 0.969 |
| 0.8584877190410178 | 0.97 |
| 0.7893627855731309 | 0.971 |
| 0.7447713958707534 | 0.972 |
| 0.6112029783145364 | 0.973 |
| 0.7811077847612378 | 0.974 |
| 0.8155611792858258 | 0.975 |
| 0.6491613067086003 | 0.976 |
| 0.6389719701558032 | 0.977 |
| 0.6101902566419698 | 0.978 |
| 0.7393906348295091 | 0.979 |
| 0.7667861484334233 | 0.98 |
| 0.6754198007143194 | 0.981 |
| 0.7836155214320794 | 0.982 |
| 0.6624151671868438 | 0.983 |
| 0.7160283365966451 | 0.984 |
| 0.8318054666303119 | 0.985 |
| 0.8811564181739374 | 0.986 |
| 0.8332586454860779 | 0.987 |
| 0.6910608853934587 | 0.988 |
| 0.8702657825066109 | 0.989 |
| 0.7777756921322411 | 0.99 |
| 0.7620352655700734 | 0.991 |
| 0.7649627898334792 | 0.992 |
| 0.8797178511886103 | 0.993 |
| 0.6182845906110516 | 0.994 |
| 0.7393039879855817 | 0.995 |
| 0.8984845738217879 | 0.996 |
| 0.7008585026289228 | 0.997 |
| 0.8358632141655484 | 0.998 |
| 0.7687647520936395 | 0.999 |
| 0.8564027590571174 | 1 |